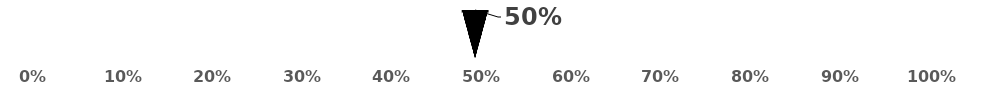
| Category | Series 0 | Series 1 | Series 2 |
|---|---|---|---|
| 0 | 0.475 | 0.03 | 0.5 |